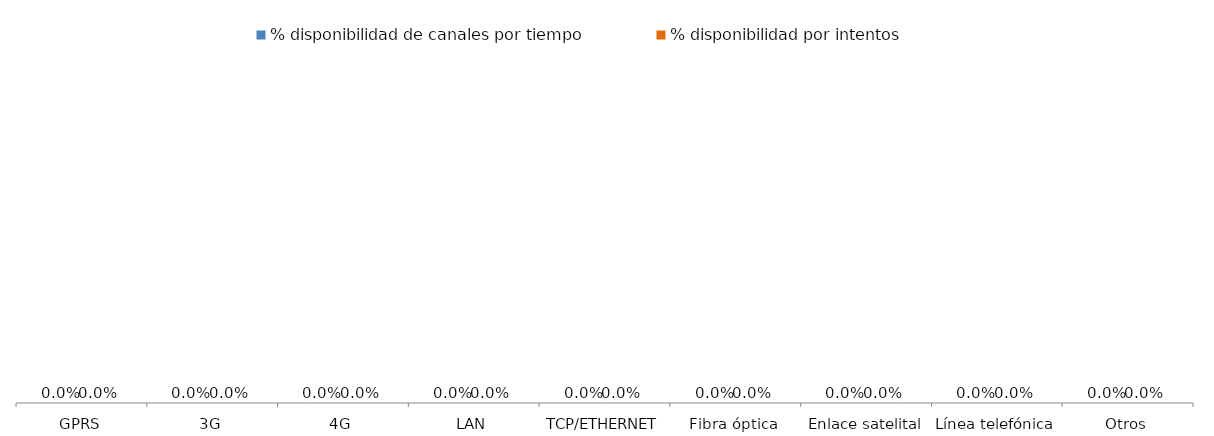
| Category | % disponibilidad de canales por tiempo | % disponibilidad por intentos |
|---|---|---|
| GPRS | 0 | 0 |
| 3G | 0 | 0 |
| 4G | 0 | 0 |
| LAN | 0 | 0 |
| TCP/ETHERNET | 0 | 0 |
| Fibra óptica | 0 | 0 |
| Enlace satelital | 0 | 0 |
| Línea telefónica | 0 | 0 |
| Otros | 0 | 0 |